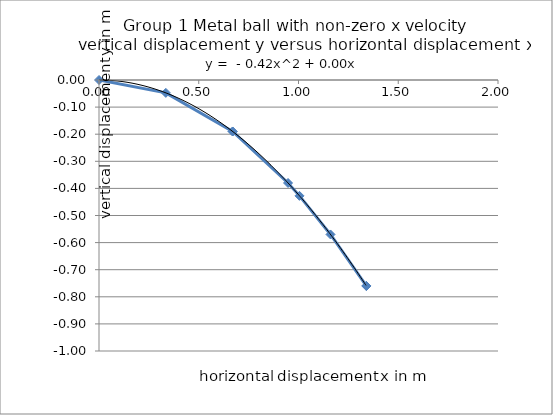
| Category | Series 0 |
|---|---|
| 0.0 | 0 |
| 0.335 | -0.048 |
| 0.67 | -0.19 |
| 0.67 | -0.19 |
| 0.9475230867899738 | -0.38 |
| 1.0050000000000001 | -0.428 |
| 1.1604740410711478 | -0.57 |
| 1.34 | -0.76 |
| 1.34 | -0.76 |